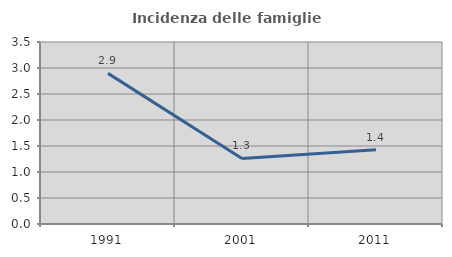
| Category | Incidenza delle famiglie numerose |
|---|---|
| 1991.0 | 2.896 |
| 2001.0 | 1.26 |
| 2011.0 | 1.429 |